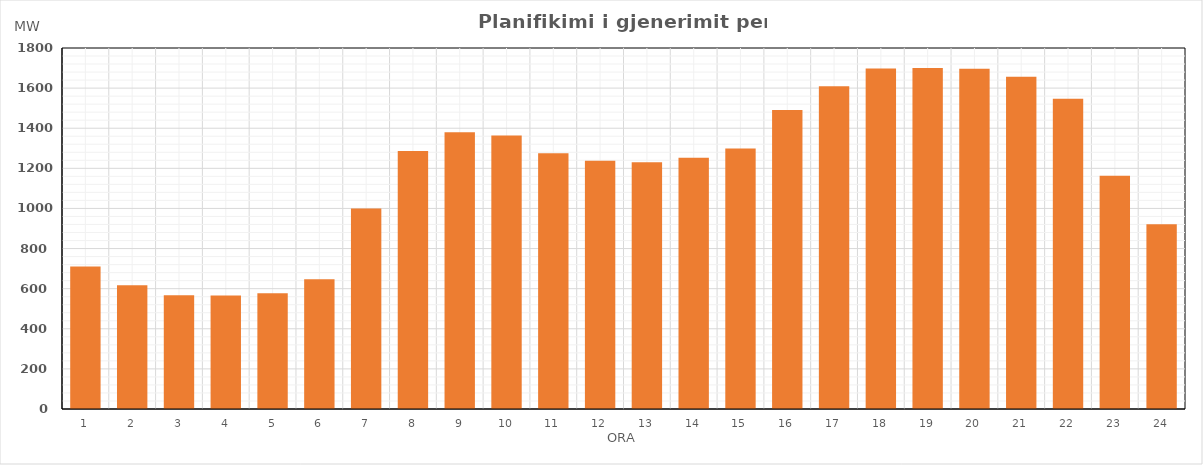
| Category | Max (MW) |
|---|---|
| 0 | 710.49 |
| 1 | 617.39 |
| 2 | 567.26 |
| 3 | 565.84 |
| 4 | 577.24 |
| 5 | 647.18 |
| 6 | 999.78 |
| 7 | 1286 |
| 8 | 1379.59 |
| 9 | 1364.29 |
| 10 | 1274.68 |
| 11 | 1237.74 |
| 12 | 1230.23 |
| 13 | 1252.83 |
| 14 | 1298.6 |
| 15 | 1491.25 |
| 16 | 1608.77 |
| 17 | 1697.18 |
| 18 | 1700.26 |
| 19 | 1697.16 |
| 20 | 1656.59 |
| 21 | 1546.98 |
| 22 | 1162.4 |
| 23 | 921.11 |